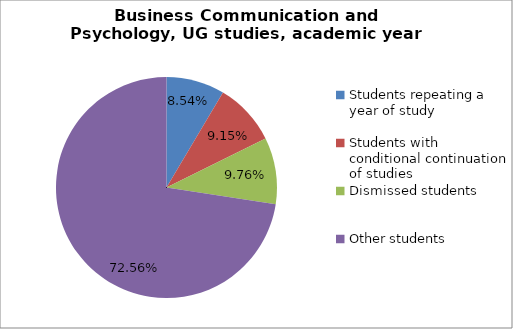
| Category | Series 0 |
|---|---|
| Students repeating a year of study | 14 |
| Students with conditional continuation of studies | 15 |
| Dismissed students | 16 |
| Other students | 119 |